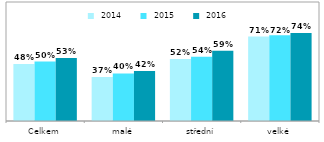
| Category |  2014 |  2015 |  2016 |
|---|---|---|---|
| Celkem | 0.48 | 0.5 | 0.53 |
| malé | 0.37 | 0.4 | 0.42 |
| střední | 0.52 | 0.54 | 0.59 |
| velké | 0.71 | 0.72 | 0.74 |